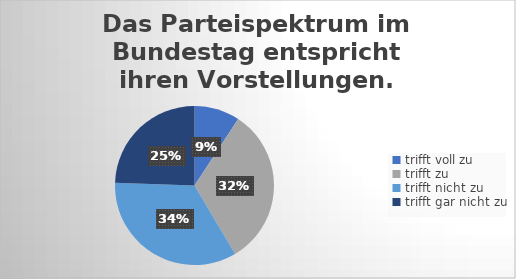
| Category | Das Parteispektrum im Bundestag entspricht ihren Vorstellungen. |
|---|---|
| trifft voll zu | 25 |
| trifft zu  | 87 |
| trifft nicht zu  | 92 |
| trifft gar nicht zu | 66 |